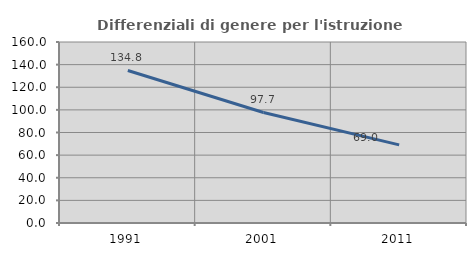
| Category | Differenziali di genere per l'istruzione superiore |
|---|---|
| 1991.0 | 134.824 |
| 2001.0 | 97.712 |
| 2011.0 | 69.049 |